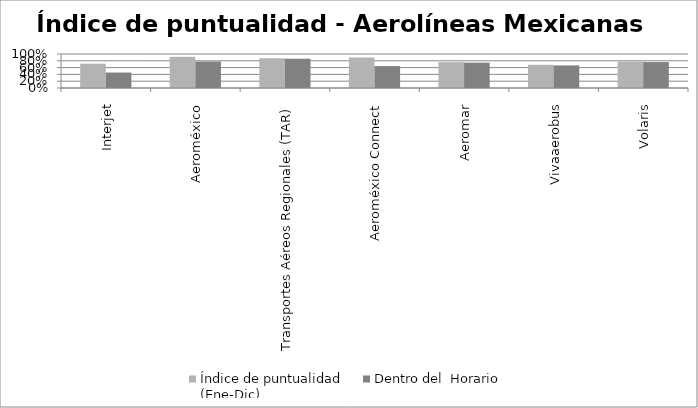
| Category | Índice de puntualidad
(Ene-Dic) | Dentro del  Horario |
|---|---|---|
| Interjet | 0.715 | 0.455 |
| Aeroméxico | 0.917 | 0.778 |
| Transportes Aéreos Regionales (TAR) | 0.875 | 0.861 |
| Aeroméxico Connect | 0.898 | 0.644 |
| Aeromar | 0.76 | 0.746 |
| Vivaaerobus | 0.683 | 0.664 |
| Volaris | 0.778 | 0.763 |